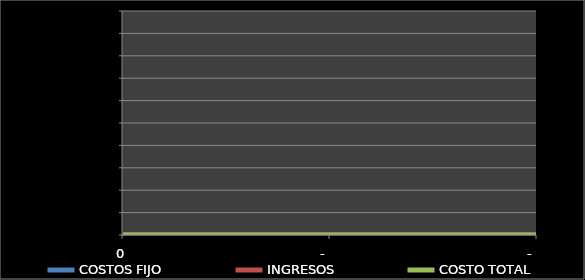
| Category | COSTOS FIJO | INGRESOS | COSTO TOTAL |
|---|---|---|---|
| 0.0 | 0 | 0 | 0 |
| 0.0 | 0 | 0 | 0 |
| 0.0 | 0 | 0 | 0 |